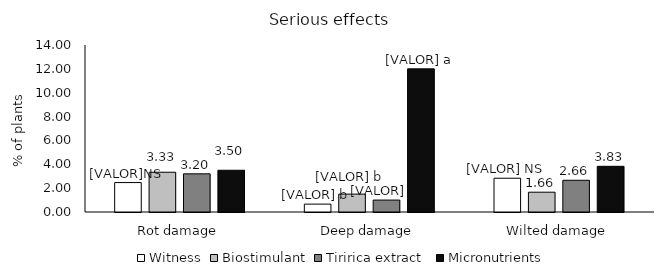
| Category | Witness | Biostimulant | Tiririca extract  | Micronutrients |
|---|---|---|---|---|
| Rot damage | 2.467 | 3.333 | 3.2 | 3.5 |
| Deep damage | 0.66 | 1.5 | 1 | 12 |
| Wilted damage | 2.83 | 1.66 | 2.66 | 3.83 |